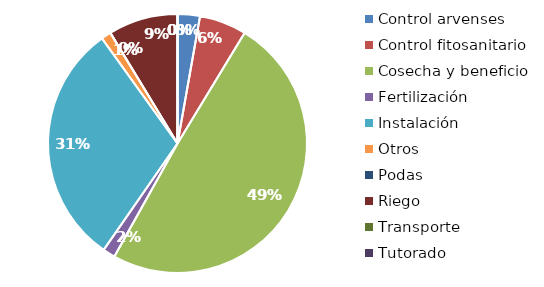
| Category | Valor |
|---|---|
| Control arvenses | 315000 |
| Control fitosanitario | 665000 |
| Cosecha y beneficio | 5580000 |
| Fertilización | 175000 |
| Instalación | 3435000 |
| Otros | 140000 |
| Podas | 0 |
| Riego | 980000 |
| Transporte | 0 |
| Tutorado | 0 |